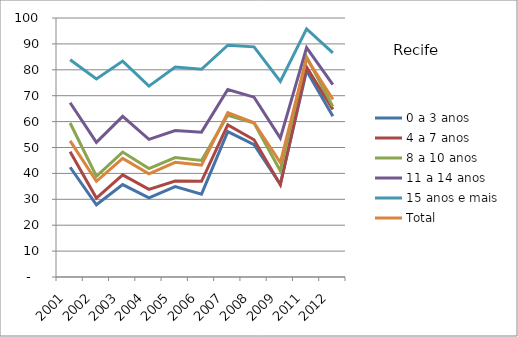
| Category | 0 a 3 anos | 4 a 7 anos | 8 a 10 anos | 11 a 14 anos | 15 anos e mais | Total |
|---|---|---|---|---|---|---|
| 2001.0 | 42.38 | 48.38 | 59.45 | 67.28 | 83.87 | 52.58 |
| 2002.0 | 27.9 | 30.46 | 38.9 | 52.01 | 76.44 | 36.95 |
| 2003.0 | 35.67 | 39.44 | 48.23 | 62.02 | 83.37 | 45.79 |
| 2004.0 | 30.54 | 33.84 | 41.88 | 53.15 | 73.71 | 39.86 |
| 2005.0 | 34.92 | 37.07 | 46.1 | 56.58 | 81.06 | 44.26 |
| 2006.0 | 32.01 | 36.95 | 44.98 | 55.93 | 80.2 | 43.22 |
| 2007.0 | 56.12 | 58.75 | 62.45 | 72.41 | 89.48 | 63.48 |
| 2008.0 | 51.08 | 52.98 | 59.48 | 69.43 | 88.86 | 59.61 |
| 2009.0 | 35.79 | 35.63 | 40.99 | 53.62 | 75.51 | 44.14 |
| 2011.0 | 79.62 | 81.04 | 84.93 | 88.56 | 95.82 | 84.43 |
| 2012.0 | 62.04 | 64.71 | 65.78 | 74.26 | 86.54 | 68.58 |